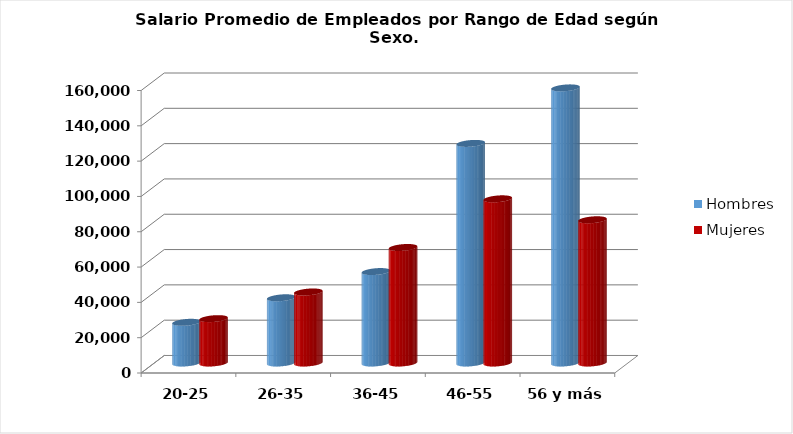
| Category | Hombres | Mujeres |
|---|---|---|
| 20-25 | 23047 | 25129 |
| 26-35 | 36939 | 40226 |
| 36-45 | 51794 | 65421 |
| 46-55 | 124382 | 92983 |
| 56 y más | 155830.4 | 81120 |